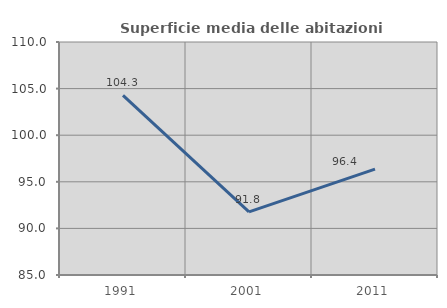
| Category | Superficie media delle abitazioni occupate |
|---|---|
| 1991.0 | 104.274 |
| 2001.0 | 91.765 |
| 2011.0 | 96.364 |